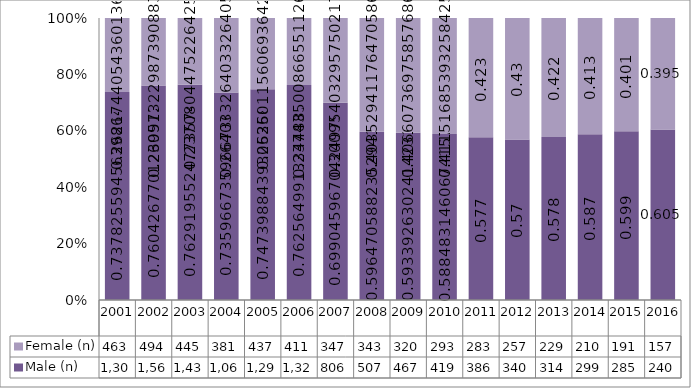
| Category | Male (n) | Female (n) |
|---|---|---|
| 2001.0 | 1303 | 463 |
| 2002.0 | 1568 | 494 |
| 2003.0 | 1432 | 445 |
| 2004.0 | 1062 | 381 |
| 2005.0 | 1293 | 437 |
| 2006.0 | 1320 | 411 |
| 2007.0 | 806 | 347 |
| 2008.0 | 507 | 343 |
| 2009.0 | 467 | 320 |
| 2010.0 | 419 | 293 |
| 2011.0 | 386 | 283 |
| 2012.0 | 340 | 257 |
| 2013.0 | 314 | 229 |
| 2014.0 | 299 | 210 |
| 2015.0 | 285 | 191 |
| 2016.0 | 240 | 157 |